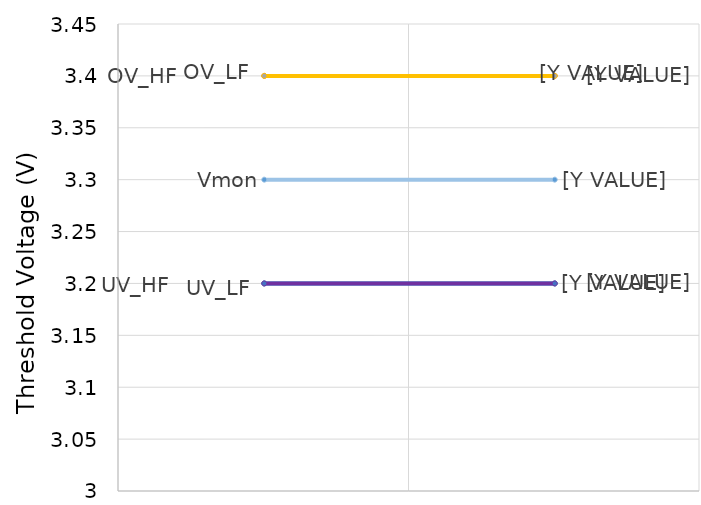
| Category | Vmon | OV_HF | OV_LF | UV_LF | UV_HF |
|---|---|---|---|---|---|
| 0.0 | 3.3 | 3.4 | 3.4 | 3.2 | 3.2 |
| 1.0 | 3.3 | 3.4 | 3.4 | 3.2 | 3.2 |